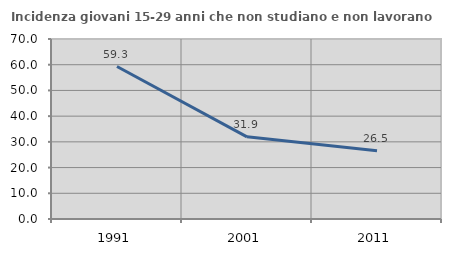
| Category | Incidenza giovani 15-29 anni che non studiano e non lavorano  |
|---|---|
| 1991.0 | 59.293 |
| 2001.0 | 31.944 |
| 2011.0 | 26.51 |